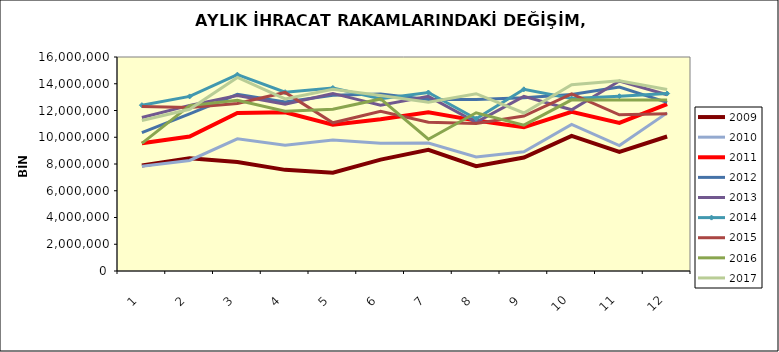
| Category | 2009 | 2010 | 2011 | 2012 | 2013 | 2014 | 2015 | 2016 | 2017 |
|---|---|---|---|---|---|---|---|---|---|
| 0 | 7884493.524 | 7828748.058 | 9551084.639 | 10348187.166 | 11481521.079 | 12399761.948 | 12301766.75 | 9546115.4 | 11249354 |
| 1 | 8435115.834 | 8263237.814 | 10059126.307 | 11748000.124 | 12385690.909 | 13053292.493 | 12231860.14 | 12366388.057 | 12091274 |
| 2 | 8155485.081 | 9886488.171 | 11811085.16 | 13208572.977 | 13122058.141 | 14680110.78 | 12519910.438 | 12757672.093 | 14473887 |
| 3 | 7561696.283 | 9396006.654 | 11873269.447 | 12630226.718 | 12468202.903 | 13371185.664 | 13349346.866 | 11950497.685 | 12861395 |
| 4 | 7346407.528 | 9799958.117 | 10943364.372 | 13131530.961 | 13277209.017 | 13681906.159 | 11080385.127 | 12098611.067 | 13585046 |
| 5 | 8329692.783 | 9542907.644 | 11349953.558 | 13231198.688 | 12399973.962 | 12880924.246 | 11949647.086 | 12864154.06 | 13127944 |
| 6 | 9055733.671 | 9564682.545 | 11860004.271 | 12830675.307 | 13059519.685 | 13344776.958 | 11129358.974 | 9850124.872 | 12615027 |
| 7 | 7839908.842 | 8523451.973 | 11245124.657 | 12831394.572 | 11118300.903 | 11386828.925 | 11022045.344 | 11830762.82 | 13253678 |
| 8 | 8480708.387 | 8909230.521 | 10750626.099 | 12952651.722 | 13060371.039 | 13583120.906 | 11581703.842 | 10901638.452 | 11814796 |
| 9 | 10095768.03 | 10963586.27 | 11907219.297 | 13190769.655 | 12053704.638 | 12891630.102 | 13240039.088 | 12796159.91 | 13923512 |
| 10 | 8903010.773 | 9382369.718 | 11078524.743 | 13753052.493 | 14201227.351 | 13067348.107 | 11681989.013 | 12786936.247 | 14216607 |
| 11 | 10054591.867 | 11822551.699 | 12477486.28 | 12605476.173 | 13174857.46 | 13269271.402 | 11750818.76 | 12780523.145 | 13569737.017 |